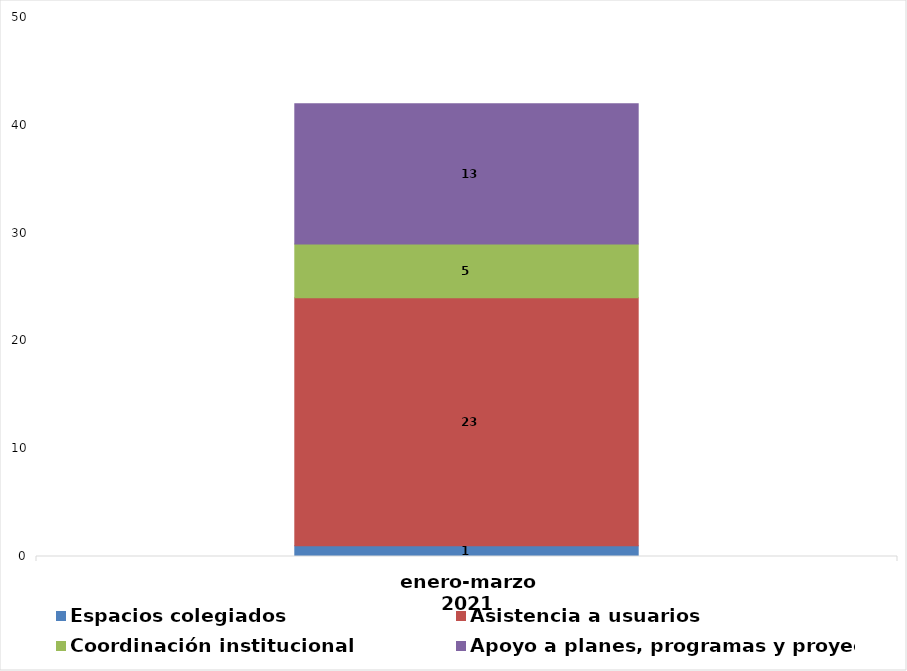
| Category | Espacios colegiados | Asistencia a usuarios  | Coordinación institucional  | Apoyo a planes, programas y proyectos |
|---|---|---|---|---|
| enero-marzo 2021 | 1 | 23 | 5 | 13 |